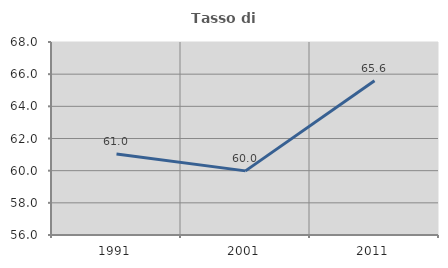
| Category | Tasso di occupazione   |
|---|---|
| 1991.0 | 61.032 |
| 2001.0 | 59.987 |
| 2011.0 | 65.593 |